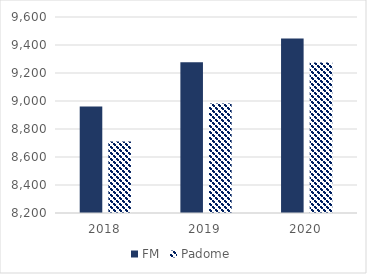
| Category | FM | Padome |
|---|---|---|
| 2018.0 | 8960.544 | 8711.33 |
| 2019.0 | 9276.348 | 8982.901 |
| 2020.0 | 9446.527 | 9274.982 |